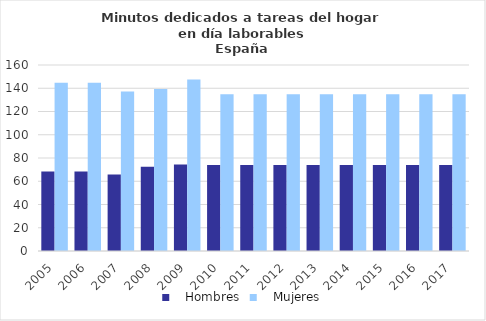
| Category |    Hombres |    Mujeres |
|---|---|---|
| 2005.0 | 68.287 | 144.73 |
| 2006.0 | 68.287 | 144.73 |
| 2007.0 | 65.808 | 137.1 |
| 2008.0 | 72.52 | 139.46 |
| 2009.0 | 74.445 | 147.42 |
| 2010.0 | 73.902 | 134.75 |
| 2011.0 | 73.902 | 134.75 |
| 2012.0 | 73.902 | 134.75 |
| 2013.0 | 73.902 | 134.75 |
| 2014.0 | 73.902 | 134.75 |
| 2015.0 | 73.902 | 134.75 |
| 2016.0 | 73.902 | 134.75 |
| 2017.0 | 73.902 | 134.75 |